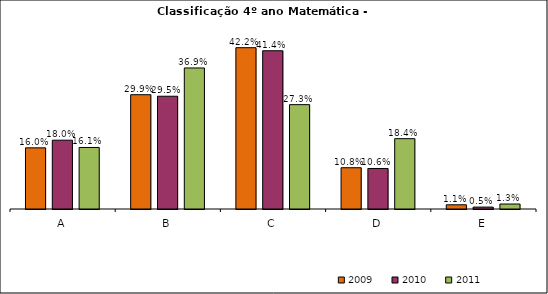
| Category | 2009 | 2010 | 2011 |
|---|---|---|---|
| A | 0.16 | 0.18 | 0.161 |
| B | 0.299 | 0.295 | 0.369 |
| C | 0.422 | 0.414 | 0.273 |
| D | 0.108 | 0.106 | 0.184 |
| E | 0.011 | 0.005 | 0.013 |